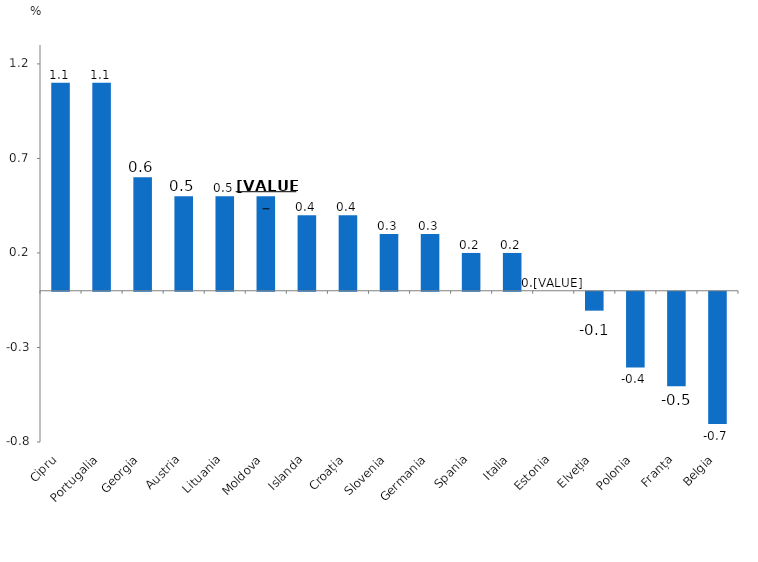
| Category | Series 0 |
|---|---|
| Cipru | 1.1 |
| Portugalia | 1.1 |
| Georgia | 0.6 |
| Austria | 0.5 |
| Lituania | 0.5 |
| Moldova | 0.5 |
| Islanda | 0.4 |
| Croația | 0.4 |
| Slovenia | 0.3 |
| Germania | 0.3 |
| Spania | 0.2 |
| Italia | 0.2 |
| Estonia | 0 |
| Elveția | -0.1 |
| Polonia | -0.4 |
| Franța | -0.5 |
| Belgia | -0.7 |